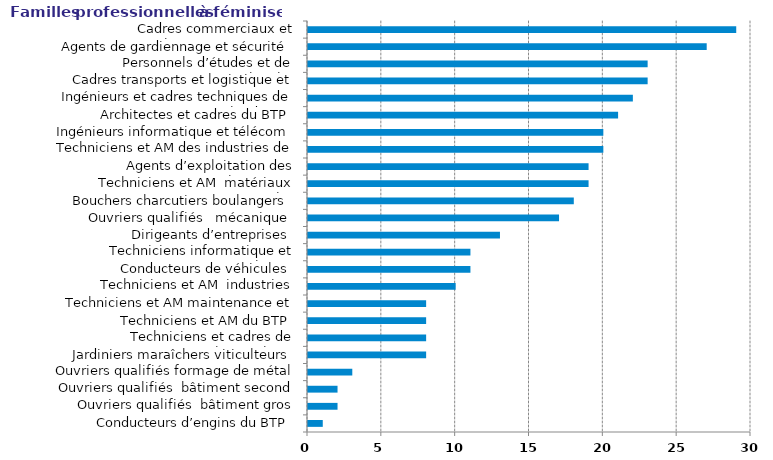
| Category | Series 0 |
|---|---|
| Conducteurs d’engins du BTP | 1 |
| Ouvriers qualifiés  bâtiment gros œuvre  | 2 |
| Ouvriers qualifiés  bâtiment second œuvre | 2 |
| Ouvriers qualifiés formage de métal | 3 |
| Jardiniers maraîchers viticulteurs | 8 |
| Techniciens et cadres de l’agriculture | 8 |
| Techniciens et AM du BTP | 8 |
| Techniciens et AM maintenance et environnement | 8 |
| Techniciens et AM  industries mécaniques | 10 |
| Conducteurs de véhicules | 11 |
| Techniciens informatique et télécom | 11 |
| Dirigeants d’entreprises | 13 |
| Ouvriers qualifiés   mécanique | 17 |
| Bouchers charcutiers boulangers | 18 |
| Techniciens et AM  matériaux souples | 19 |
| Agents d’exploitation des transports et logistique | 19 |
| Techniciens et AM des industries de process | 20 |
| Ingénieurs informatique et télécom | 20 |
| Architectes et cadres du BTP | 21 |
| Ingénieurs et cadres techniques de l'industrie | 22 |
| Cadres transports et logistique et navigants | 23 |
| Personnels d’études et de recherche | 23 |
| Agents de gardiennage et sécurité | 27 |
| Cadres commerciaux et technico-commerciaux | 29 |